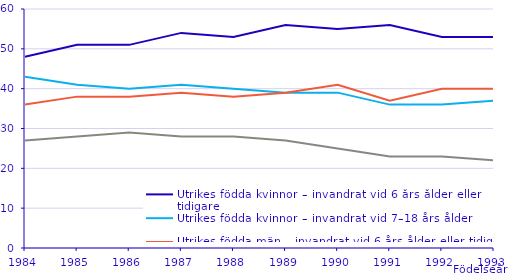
| Category | Utrikes födda kvinnor – invandrat vid 6 års ålder eller tidigare  | Utrikes födda kvinnor – invandrat vid 7–18 års ålder | Utrikes födda män – invandrat vid 6 års ålder eller tidigare  | Utrikes födda män – invandrat vid 7-18 års ålder |
|---|---|---|---|---|
| 1984.0 | 48 | 43 | 36 | 27 |
| 1985.0 | 51 | 41 | 38 | 28 |
| 1986.0 | 51 | 40 | 38 | 29 |
| 1987.0 | 54 | 41 | 39 | 28 |
| 1988.0 | 53 | 40 | 38 | 28 |
| 1989.0 | 56 | 39 | 39 | 27 |
| 1990.0 | 55 | 39 | 41 | 25 |
| 1991.0 | 56 | 36 | 37 | 23 |
| 1992.0 | 53 | 36 | 40 | 23 |
| 1993.0 | 53 | 37 | 40 | 22 |